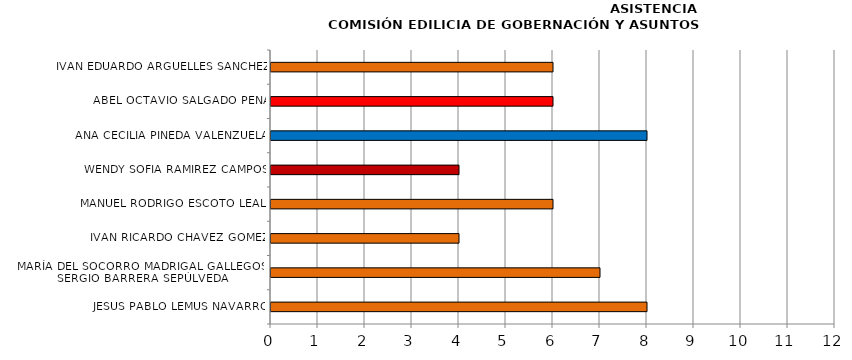
| Category | Series 0 |
|---|---|
| JESÚS PABLO LEMUS NAVARRO | 8 |
| MARÍA DEL SOCORRO MADRIGAL GALLEGOS/
SERGIO BARRERA SEPÚLVEDA | 7 |
| IVÁN RICARDO CHÁVEZ GÓMEZ | 4 |
| MANUEL RODRIGO ESCOTO LEAL  | 6 |
| WENDY SOFIA RAMÍREZ CAMPOS | 4 |
| ANA CECILIA PINEDA VALENZUELA | 8 |
| ABEL OCTAVIO SALGADO PEÑA | 6 |
| IVÁN EDUARDO ARGUELLES SANCHEZ | 6 |